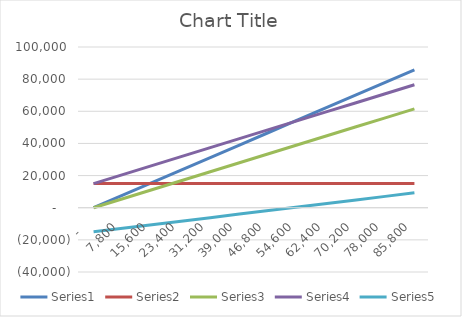
| Category | Series 0 | Series 1 | Series 2 | Series 3 | Series 4 |
|---|---|---|---|---|---|
| 0.0 | 0 | 15000 | 0 | 15000 | -15000 |
| 7799.999999999995 | 7800 | 15000 | 5594 | 20594 | -12794 |
| 15599.99999999999 | 15600 | 15000 | 11188 | 26188 | -10588 |
| 23399.999999999985 | 23400 | 15000 | 16782 | 31782 | -8382 |
| 31199.99999999998 | 31200 | 15000 | 22376 | 37376 | -6176 |
| 38999.99999999998 | 39000 | 15000 | 27970 | 42970 | -3970 |
| 46799.99999999997 | 46800 | 15000 | 33564 | 48564 | -1764 |
| 54599.99999999996 | 54600 | 15000 | 39158 | 54158 | 442 |
| 62399.999999999956 | 62400 | 15000 | 44752 | 59752 | 2648 |
| 70199.99999999996 | 70200 | 15000 | 50346 | 65346 | 4854 |
| 77999.99999999996 | 78000 | 15000 | 55940 | 70940 | 7060 |
| 85799.99999999996 | 85800 | 15000 | 61534 | 76534 | 9266 |